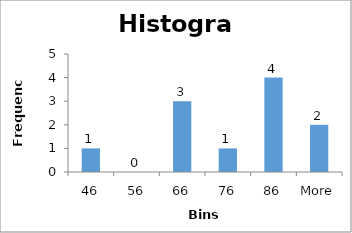
| Category | Frequency |
|---|---|
| 46 | 1 |
| 56 | 0 |
| 66 | 3 |
| 76 | 1 |
| 86 | 4 |
| More | 2 |